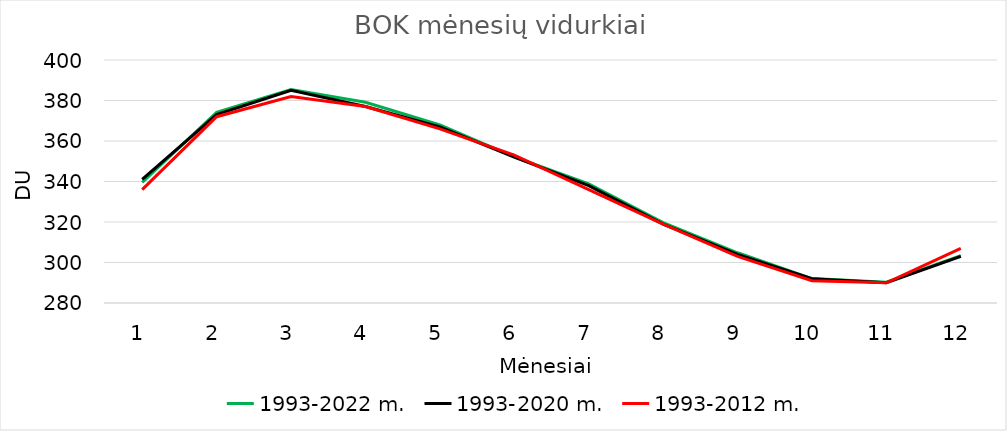
| Category | 1993-2022 m. | 1993-2020 m. | 1993-2012 m. |
|---|---|---|---|
| 0 | 339.571 | 341 | 336 |
| 1 | 374.172 | 373 | 372 |
| 2 | 385.409 | 385 | 382 |
| 3 | 379.115 | 377 | 377 |
| 4 | 367.956 | 367 | 366 |
| 5 | 352.135 | 352 | 353 |
| 6 | 338.823 | 338 | 336 |
| 7 | 319.725 | 319 | 319 |
| 8 | 304.806 | 304 | 303 |
| 9 | 292.072 | 292 | 291 |
| 10 | 290.264 | 290 | 290 |
| 11 | 303.316 | 303 | 307 |